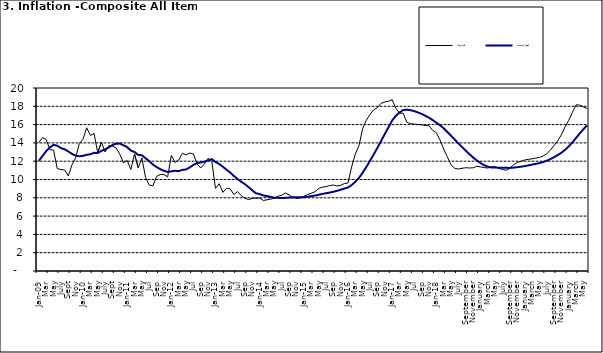
| Category | Year-on Rate | 12-Month Average |
|---|---|---|
| Jan-09 | 14.034 | 12.032 |
| Feb | 14.584 | 12.567 |
| Mar | 14.366 | 13.101 |
| Apr | 13.268 | 13.51 |
| May | 13.212 | 13.787 |
| June | 11.194 | 13.694 |
| July | 11.09 | 13.437 |
| Aug | 11.046 | 13.307 |
| Sept | 10.39 | 13.065 |
| Oct | 11.588 | 12.803 |
| Nov | 12.368 | 12.609 |
| Dec | 13.93 | 12.538 |
| Jan-10 | 14.398 | 12.586 |
| Feb | 15.649 | 12.7 |
| Mar | 14.812 | 12.757 |
| Apr | 15.044 | 12.915 |
| May | 12.915 | 12.893 |
| June | 14.099 | 13.132 |
| July | 13.002 | 13.284 |
| Aug | 13.702 | 13.5 |
| Sept | 13.65 | 13.764 |
| Oct | 13.45 | 13.908 |
| Nov | 12.766 | 13.928 |
| Dec | 11.815 | 13.74 |
| Jan-11 | 12.08 | 13.542 |
| Feb | 11.1 | 13.161 |
| Mar | 12.779 | 13.001 |
| Apr | 11.291 | 12.694 |
| May | 12.352 | 12.648 |
| Jun | 10.23 | 12.321 |
| Jul | 9.397 | 12.009 |
| Aug | 9.301 | 11.635 |
| Sep | 10.339 | 11.363 |
| Oct | 10.544 | 11.13 |
| Nov | 10.54 | 10.952 |
| Dec | 10.283 | 10.826 |
| Jan-12 | 12.626 | 10.886 |
| Feb | 11.866 | 10.955 |
| Mar | 12.111 | 10.914 |
| Apr | 12.866 | 11.054 |
| May | 12.688 | 11.096 |
| Jun | 12.892 | 11.32 |
| Jul | 12.797 | 11.599 |
| Aug | 11.689 | 11.791 |
| Sep | 11.253 | 11.859 |
| Oct | 11.693 | 11.948 |
| Nov | 12.32 | 12.091 |
| Dec | 11.981 | 12.224 |
| Jan-13 | 9.031 | 11.908 |
| Feb | 9.542 | 11.703 |
| Mar | 8.593 | 11.394 |
| Apr | 9.052 | 11.072 |
| May | 8.964 | 10.761 |
| Jun | 8.353 | 10.383 |
| Jul | 8.682 | 10.047 |
| Aug | 8.231 | 9.761 |
| Sep | 7.952 | 9.486 |
| Oct | 7.807 | 9.167 |
| Nov | 7.931 | 8.815 |
| Dec | 7.957 | 8.496 |
| Jan-14 | 7.977 | 8.408 |
| Feb | 7.707 | 8.257 |
| Mar | 7.783 | 8.19 |
| Apr | 7.851 | 8.092 |
| May | 7.965 | 8.012 |
| Jun | 8.167 | 7.998 |
| Jul | 8.281 | 7.968 |
| Aug | 8.534 | 7.996 |
| Sep | 8.317 | 8.027 |
| Oct | 8.06 | 8.047 |
| Nov | 7.927 | 8.046 |
| Dec | 7.978 | 8.047 |
| Jan-15 | 8.157 | 8.063 |
| Feb | 8.359 | 8.117 |
| Mar | 8.494 | 8.176 |
| Apr | 8.655 | 8.243 |
| May | 9.003 | 8.331 |
| Jun | 9.168 | 8.417 |
| Jul | 9.218 | 8.497 |
| Aug | 9.336 | 8.566 |
| Sep | 9.394 | 8.658 |
| Oct | 9.296 | 8.76 |
| Nov | 9.368 | 8.879 |
| Dec | 9.554 | 9.009 |
| Jan-16 | 9.617 | 9.13 |
| Feb | 11.379 | 9.386 |
| Mar | 12.775 | 9.751 |
| Apr | 13.721 | 10.182 |
| May | 15.577 | 10.746 |
| Jun | 16.48 | 11.372 |
| Jul | 17.127 | 12.045 |
| Aug | 17.609 | 12.744 |
| Sep | 17.852 | 13.454 |
| Oct | 18.33 | 14.206 |
| Nov | 18.476 | 14.958 |
| Dec | 18.547 | 15.697 |
| Jan-17 | 18.719 | 16.441 |
| Feb | 17.78 | 16.958 |
| Mar | 17.256 | 17.315 |
| Apr | 17.244 | 17.591 |
| May | 16.251 | 17.628 |
| Jun | 16.098 | 17.578 |
| Jul | 16.053 | 17.475 |
| Aug | 16.012 | 17.331 |
| Sep | 15.979 | 17.17 |
| Oct | 15.905 | 16.968 |
| Nov | 15.901 | 16.76 |
| Dec | 15.372 | 16.502 |
| Jan-18 | 15.127 | 16.215 |
| Feb | 14.33 | 15.93 |
| Mar | 13.337 | 15.599 |
| Apr | 12.482 | 15.196 |
| May | 11.608 | 14.793 |
| June | 11.231 | 14.371 |
| July | 11.142 | 13.95 |
| August | 11.227 | 13.546 |
| September | 11.284 | 13.157 |
| October | 11.259 | 12.777 |
| November | 11.281 | 12.406 |
| December | 11.442 | 12.095 |
| January | 11.374 | 11.801 |
| February | 11.306 | 11.564 |
| March | 11.251 | 11.401 |
| April | 11.372 | 11.314 |
| May | 11.396 | 11.299 |
| June | 11.217 | 11.297 |
| July | 11.084 | 11.291 |
| August | 11.016 | 11.271 |
| September | 11.244 | 11.268 |
| October | 11.607 | 11.298 |
| November | 11.854 | 11.348 |
| December | 11.982 | 11.396 |
| January | 12.132 | 11.462 |
| February | 12.199 | 11.539 |
| March | 12.257 | 11.624 |
| April | 12.341 | 11.706 |
| May | 12.404 | 11.791 |
| June | 12.559 | 11.904 |
| July | 12.821 | 12.049 |
| August | 13.22 | 12.233 |
| September | 13.707 | 12.44 |
| October | 14.233 | 12.664 |
| November | 14.887 | 12.923 |
| December | 15.753 | 13.246 |
| January | 16.466 | 13.616 |
| February | 17.335 | 14.053 |
| March | 18.171 | 14.554 |
| April | 18.117 | 15.039 |
| May | 17.933 | 15.499 |
| June | 17.751 | 15.927 |